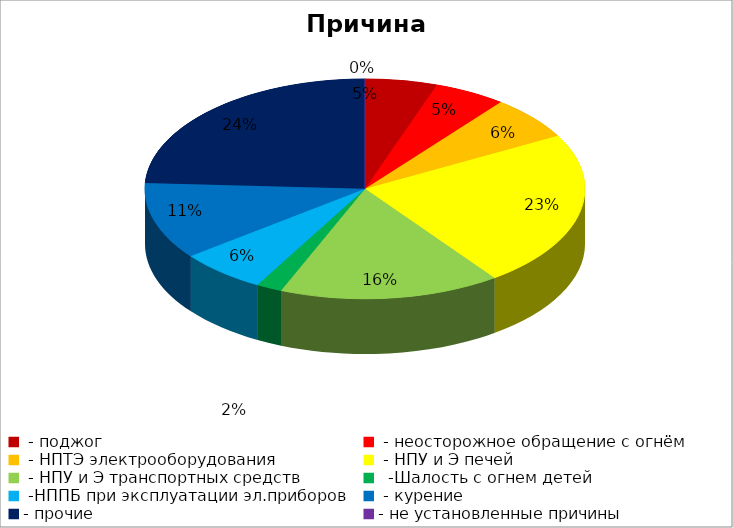
| Category | Причина пожара |
|---|---|
|  - поджог | 14 |
|  - неосторожное обращение с огнём | 14 |
|  - НПТЭ электрооборудования | 17 |
|  - НПУ и Э печей | 61 |
|  - НПУ и Э транспортных средств | 43 |
|   -Шалость с огнем детей | 5 |
|  -НППБ при эксплуатации эл.приборов | 17 |
|  - курение | 30 |
| - прочие | 64 |
| - не установленные причины | 0 |